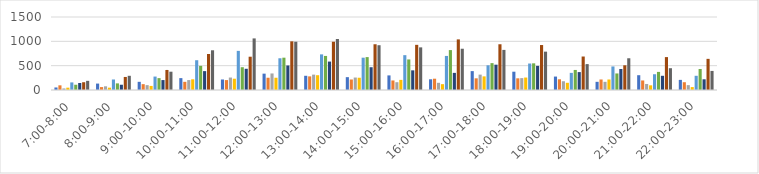
| Category | Series 0 | Series 1 | Series 2 | Series 3 | Series 4 | Series 5 | Series 6 | Series 7 | Series 8 |
|---|---|---|---|---|---|---|---|---|---|
| 7:00-8:00 | 52 | 96 | 32 | 48 | 156 | 108 | 144 | 160 | 188 |
| 8:00-9:00 | 132 | 60 | 76 | 48 | 216 | 136 | 108 | 268 | 292 |
| 9:00-10:00 | 168 | 120 | 100 | 84 | 276 | 244 | 204 | 412 | 376 |
| 10:00-11:00 | 244 | 168 | 204 | 220 | 612 | 496 | 388 | 740 | 816 |
| 11:00-12:00 | 216 | 204 | 256 | 232 | 804 | 468 | 436 | 684 | 1060 |
| 12:00-13:00 | 336 | 252 | 340 | 252 | 652 | 664 | 504 | 1000 | 992 |
| 13:00-14:00 | 292 | 280 | 316 | 304 | 732 | 700 | 584 | 992 | 1048 |
| 14:00-15:00 | 264 | 216 | 256 | 252 | 664 | 676 | 468 | 940 | 920 |
| 15:00-16:00 | 300 | 196 | 160 | 208 | 716 | 628 | 404 | 928 | 876 |
| 16:00-17:00 | 220 | 232 | 148 | 120 | 700 | 820 | 352 | 1040 | 848 |
| 17:00-18:00 | 388 | 240 | 316 | 280 | 508 | 552 | 520 | 940 | 824 |
| 18:00-19:00 | 376 | 240 | 244 | 256 | 544 | 548 | 496 | 924 | 788 |
| 19:00-20:00 | 276 | 220 | 180 | 148 | 352 | 412 | 368 | 688 | 532 |
| 20:00-21:00 | 168 | 216 | 168 | 216 | 484 | 340 | 432 | 508 | 652 |
| 21:00-22:00 | 304 | 196 | 124 | 96 | 324 | 372 | 292 | 676 | 448 |
| 22:00-23:00 | 208 | 160 | 100 | 60 | 292 | 432 | 220 | 640 | 392 |